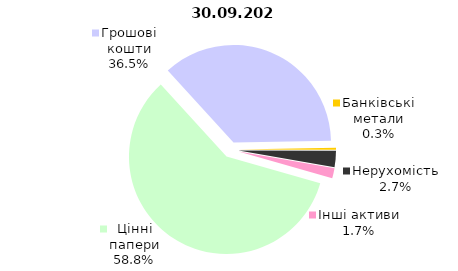
| Category | 30.09.2022 |
|---|---|
| Цінні папери | 2366 |
| Грошові кошти | 1468.079 |
| Банківські метали | 13.464 |
| Нерухомість | 109.428 |
| Інші активи | 67.773 |